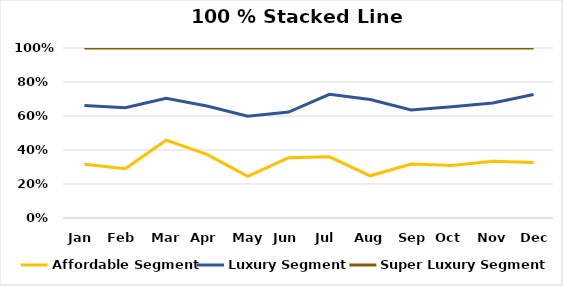
| Category | Affordable Segment | Luxury Segment | Super Luxury Segment |
|---|---|---|---|
| Jan | 173 | 189 | 185 |
| Feb | 153 | 189 | 185 |
| Mar | 195 | 105 | 126 |
| Apr | 147 | 112 | 134 |
| May | 120 | 173 | 196 |
| Jun | 144 | 109 | 153 |
| Jul | 148 | 151 | 112 |
| Aug | 109 | 197 | 133 |
| Sep | 174 | 174 | 200 |
| Oct | 130 | 145 | 145 |
| Nov | 172 | 177 | 167 |
| Dec | 131 | 161 | 110 |